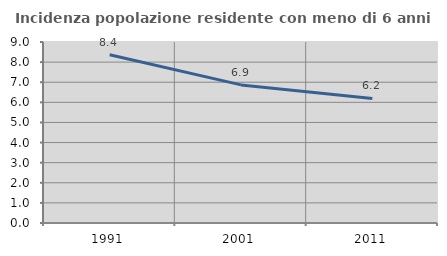
| Category | Incidenza popolazione residente con meno di 6 anni |
|---|---|
| 1991.0 | 8.369 |
| 2001.0 | 6.868 |
| 2011.0 | 6.194 |